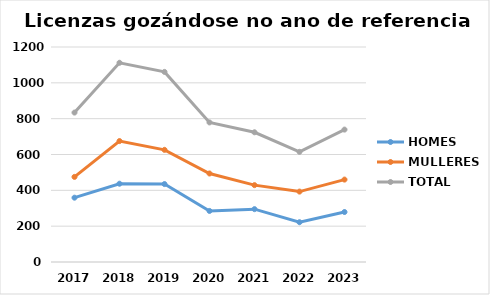
| Category | HOMES | MULLERES | TOTAL |
|---|---|---|---|
| 2017.0 | 359 | 475 | 834 |
| 2018.0 | 437 | 675 | 1112 |
| 2019.0 | 435 | 626 | 1061 |
| 2020.0 | 285 | 494 | 779 |
| 2021.0 | 295 | 429 | 724 |
| 2022.0 | 222 | 393 | 615 |
| 2023.0 | 279 | 460 | 739 |